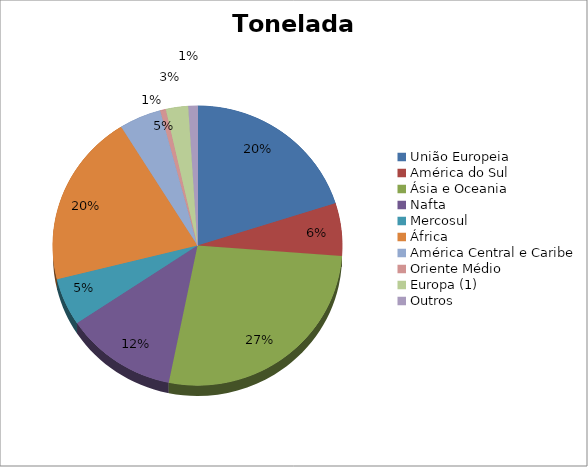
| Category | Series 0 |
|---|---|
| União Europeia | 2061904.895 |
| América do Sul | 624481.906 |
| Ásia e Oceania | 2771172.305 |
| Nafta | 1279894.248 |
| Mercosul | 562501.712 |
| África | 2054237.78 |
| América Central e Caribe | 481705.076 |
| Oriente Médio | 64817.085 |
| Europa (1) | 256829.721 |
| Outros | 104701.974 |